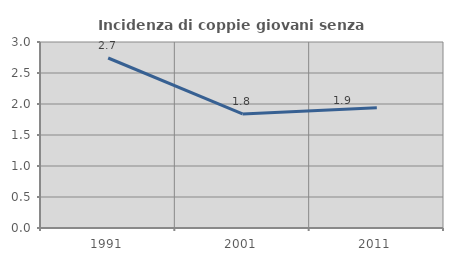
| Category | Incidenza di coppie giovani senza figli |
|---|---|
| 1991.0 | 2.742 |
| 2001.0 | 1.839 |
| 2011.0 | 1.939 |